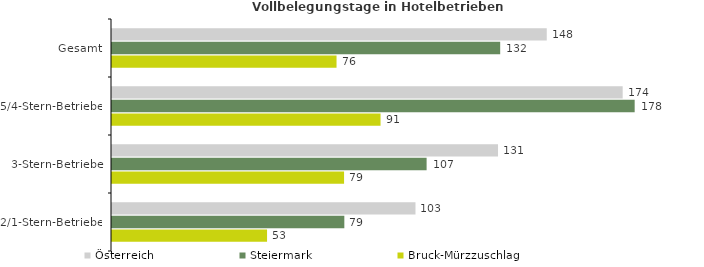
| Category | Österreich | Steiermark | Bruck-Mürzzuschlag |
|---|---|---|---|
| Gesamt | 147.876 | 132.038 | 76.372 |
| 5/4-Stern-Betriebe | 173.697 | 177.779 | 91.341 |
| 3-Stern-Betriebe | 131.294 | 107.011 | 78.935 |
| 2/1-Stern-Betriebe | 103.222 | 79.024 | 52.738 |